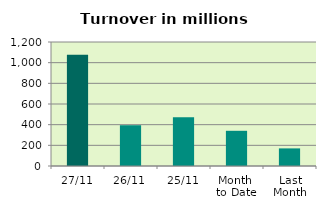
| Category | Series 0 |
|---|---|
| 27/11 | 1076.951 |
| 26/11 | 394.395 |
| 25/11 | 471.997 |
| Month 
to Date | 340.637 |
| Last
Month | 170.355 |